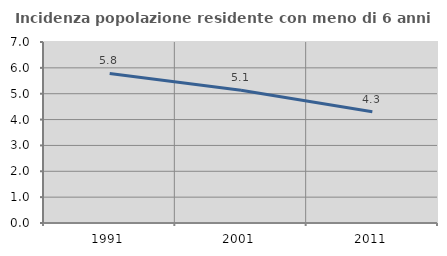
| Category | Incidenza popolazione residente con meno di 6 anni |
|---|---|
| 1991.0 | 5.782 |
| 2001.0 | 5.132 |
| 2011.0 | 4.3 |